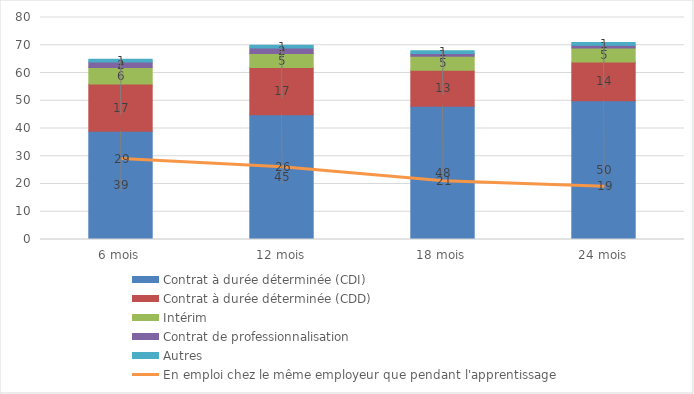
| Category | Contrat à durée déterminée (CDI) | Contrat à durée déterminée (CDD) | Intérim | Contrat de professionnalisation | Autres |
|---|---|---|---|---|---|
| 6 mois | 39 | 17 | 6 | 2 | 1 |
| 12 mois | 45 | 17 | 5 | 2 | 1 |
| 18 mois | 48 | 13 | 5 | 1 | 1 |
| 24 mois | 50 | 14 | 5 | 1 | 1 |